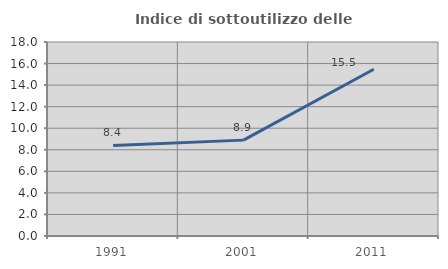
| Category | Indice di sottoutilizzo delle abitazioni  |
|---|---|
| 1991.0 | 8.406 |
| 2001.0 | 8.896 |
| 2011.0 | 15.476 |